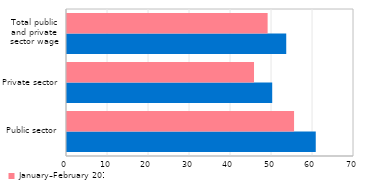
| Category | January–February 2019 | January–February 2018 |
|---|---|---|
| Public sector | 60.67 | 55.384 |
| Private sector | 50.051 | 45.615 |
| Total public
and private
sector wage | 53.474 | 48.934 |